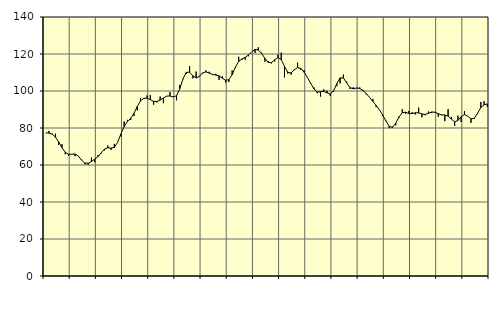
| Category | Piggar | Series 1 |
|---|---|---|
| nan | 77.3 | 77.29 |
| 87.0 | 78.3 | 77.29 |
| 87.0 | 77 | 76.69 |
| 87.0 | 76.9 | 75.03 |
| nan | 70.9 | 72.43 |
| 88.0 | 71.2 | 69.39 |
| 88.0 | 65.8 | 66.92 |
| 88.0 | 64.9 | 65.76 |
| nan | 65.9 | 65.83 |
| 89.0 | 64.8 | 65.97 |
| 89.0 | 64.9 | 64.82 |
| 89.0 | 62.9 | 62.62 |
| nan | 60.4 | 61.03 |
| 90.0 | 60.1 | 60.93 |
| 90.0 | 64 | 61.85 |
| 90.0 | 61.5 | 63.13 |
| nan | 65.4 | 64.56 |
| 91.0 | 66.3 | 66.62 |
| 91.0 | 67.9 | 68.63 |
| 91.0 | 70.5 | 69.3 |
| nan | 68.2 | 69.1 |
| 92.0 | 71.4 | 69.54 |
| 92.0 | 72.4 | 72.28 |
| 92.0 | 75.5 | 76.78 |
| nan | 83.5 | 80.84 |
| 93.0 | 84.4 | 83.51 |
| 93.0 | 84.3 | 85.25 |
| 93.0 | 86.5 | 87.85 |
| nan | 89.6 | 91.61 |
| 94.0 | 96.1 | 94.64 |
| 94.0 | 95.7 | 96.05 |
| 94.0 | 97.6 | 96.12 |
| nan | 97.8 | 95.32 |
| 95.0 | 92.6 | 94.39 |
| 95.0 | 93.8 | 94.31 |
| 95.0 | 97 | 95.1 |
| nan | 93.4 | 96.25 |
| 96.0 | 97.2 | 97.21 |
| 96.0 | 99.4 | 97.32 |
| 96.0 | 96.9 | 96.74 |
| nan | 95 | 97.46 |
| 97.0 | 103.3 | 101.3 |
| 97.0 | 106.4 | 106.66 |
| 97.0 | 109.2 | 110.11 |
| nan | 113.4 | 110.11 |
| 98.0 | 106.8 | 108.25 |
| 98.0 | 110.5 | 107.03 |
| 98.0 | 108.2 | 107.92 |
| nan | 109.5 | 109.81 |
| 99.0 | 111.1 | 110.33 |
| 99.0 | 110.4 | 109.66 |
| 99.0 | 108.7 | 108.89 |
| nan | 109.3 | 108.61 |
| 0.0 | 106 | 108.18 |
| 0.0 | 107.9 | 106.9 |
| 0.0 | 104.6 | 105.77 |
| nan | 104.9 | 106.18 |
| 1.0 | 111.1 | 108.81 |
| 1.0 | 112.4 | 112.87 |
| 1.0 | 118.5 | 116 |
| nan | 116.9 | 117.35 |
| 2.0 | 116.9 | 118.18 |
| 2.0 | 118.8 | 119.46 |
| 2.0 | 121.2 | 121.23 |
| nan | 120.6 | 122.47 |
| 3.0 | 123.6 | 122.15 |
| 3.0 | 120.7 | 120.38 |
| 3.0 | 115.9 | 117.66 |
| nan | 116.2 | 115.48 |
| 4.0 | 114.9 | 115.33 |
| 4.0 | 116 | 116.84 |
| 4.0 | 119.6 | 118.15 |
| nan | 120.7 | 116.96 |
| 5.0 | 107.4 | 113.31 |
| 5.0 | 109.4 | 110.12 |
| 5.0 | 108.8 | 109.76 |
| nan | 111.7 | 111.43 |
| 6.0 | 115.3 | 112.68 |
| 6.0 | 111.5 | 112.2 |
| 6.0 | 111.2 | 110.15 |
| nan | 107.1 | 107.37 |
| 7.0 | 104 | 104.16 |
| 7.0 | 101.9 | 101.14 |
| 7.0 | 98.8 | 99.49 |
| nan | 97 | 99.55 |
| 8.0 | 100.9 | 99.82 |
| 8.0 | 100.2 | 98.97 |
| 8.0 | 97.3 | 98.4 |
| nan | 99.6 | 100.09 |
| 9.0 | 102.6 | 103.99 |
| 9.0 | 104.1 | 107.12 |
| 9.0 | 108.9 | 107.05 |
| nan | 105.1 | 104.4 |
| 10.0 | 101.1 | 101.84 |
| 10.0 | 102 | 101.22 |
| 10.0 | 101.5 | 101.65 |
| nan | 101.9 | 101.37 |
| 11.0 | 100.5 | 100.27 |
| 11.0 | 98.2 | 98.58 |
| 11.0 | 96.5 | 96.55 |
| nan | 95.7 | 94.39 |
| 12.0 | 91.3 | 92.22 |
| 12.0 | 89.9 | 89.89 |
| 12.0 | 86.7 | 87.04 |
| nan | 84 | 83.77 |
| 13.0 | 79.9 | 80.95 |
| 13.0 | 80.7 | 80.31 |
| 13.0 | 81.5 | 82.58 |
| nan | 85.5 | 86.04 |
| 14.0 | 90.1 | 88.25 |
| 14.0 | 87.7 | 88.54 |
| 14.0 | 89.2 | 87.81 |
| nan | 88.5 | 87.76 |
| 15.0 | 87.3 | 88.26 |
| 15.0 | 91 | 88.13 |
| 15.0 | 85.8 | 87.6 |
| nan | 86.9 | 87.29 |
| 16.0 | 88.9 | 87.96 |
| 16.0 | 88.1 | 88.67 |
| 16.0 | 88.7 | 88.49 |
| nan | 86.1 | 87.72 |
| 17.0 | 86.9 | 87.09 |
| 17.0 | 83.7 | 87.04 |
| 17.0 | 90.2 | 86.45 |
| nan | 86 | 84.78 |
| 18.0 | 81.2 | 83.4 |
| 18.0 | 86.7 | 84.05 |
| 18.0 | 83.3 | 86.15 |
| nan | 89.2 | 87.25 |
| 19.0 | 86.4 | 86.38 |
| 19.0 | 82.8 | 84.94 |
| 19.0 | 84.9 | 85.22 |
| nan | 87.5 | 88 |
| 20.0 | 94.1 | 91.04 |
| 20.0 | 94.5 | 92.54 |
| 20.0 | 91.4 | 93.03 |